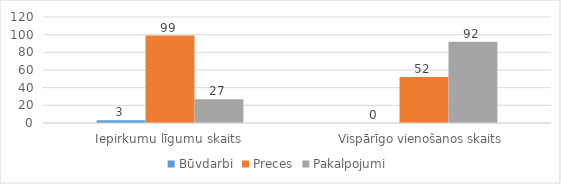
| Category | Būvdarbi | Preces | Pakalpojumi |
|---|---|---|---|
| Iepirkumu līgumu skaits | 3 | 99 | 27 |
| Vispārīgo vienošanos skaits | 0 | 52 | 92 |